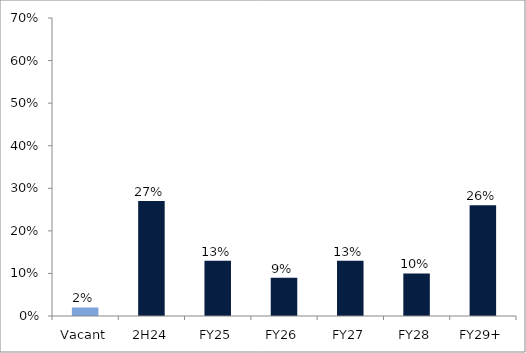
| Category | Series 0 |
|---|---|
| Vacant | 0.02 |
| 2H24 | 0.27 |
| FY25 | 0.13 |
| FY26 | 0.09 |
| FY27 | 0.13 |
| FY28 | 0.1 |
| FY29+ | 0.26 |